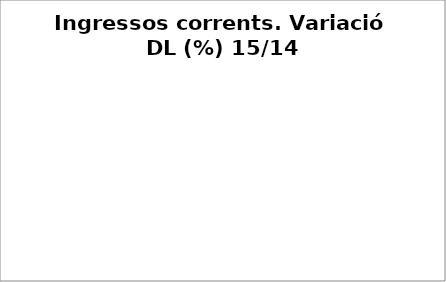
| Category | Series 0 |
|---|---|
| Impostos locals | 0.078 |
| Participació Tributs de l'Estat | 0.065 |
| Taxes i altres ingressos | -0.046 |
| Transferències corrents (exc. FCF) | 0.06 |
| Ingressos patrimonials | -0.053 |
| Ingressos corrents | 0.057 |